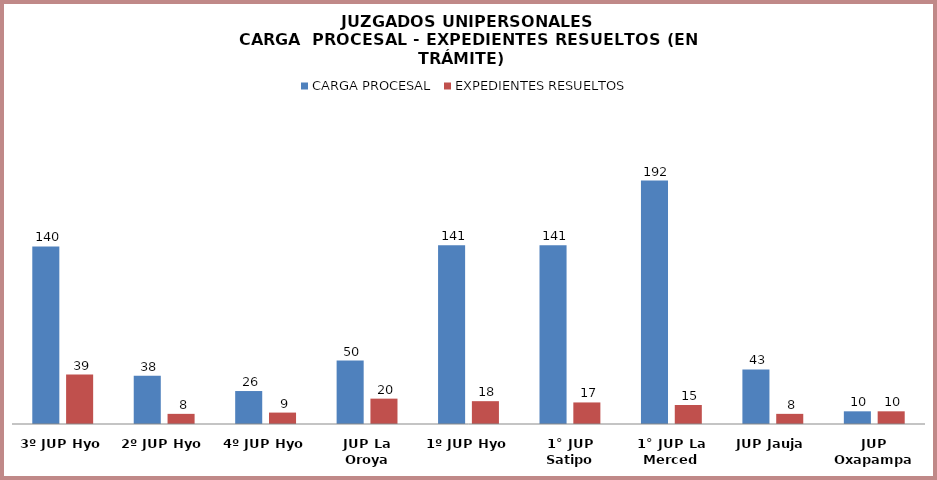
| Category | CARGA PROCESAL | EXPEDIENTES RESUELTOS |
|---|---|---|
| 3º JUP Hyo | 140 | 39 |
| 2º JUP Hyo | 38 | 8 |
| 4º JUP Hyo | 26 | 9 |
| JUP La Oroya | 50 | 20 |
| 1º JUP Hyo | 141 | 18 |
| 1° JUP Satipo | 141 | 17 |
| 1° JUP La Merced | 192 | 15 |
| JUP Jauja | 43 | 8 |
| JUP Oxapampa | 10 | 10 |